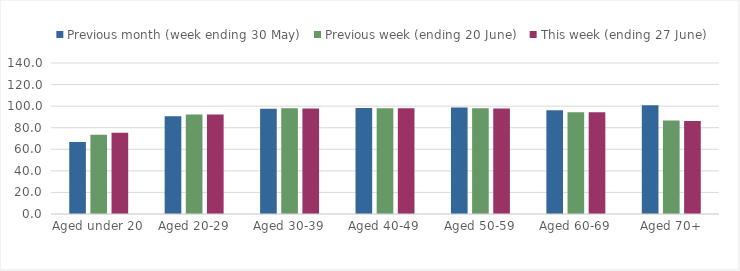
| Category | Previous month (week ending 30 May) | Previous week (ending 20 June) | This week (ending 27 June) |
|---|---|---|---|
| Aged under 20 | 66.688 | 73.555 | 75.414 |
| Aged 20-29 | 90.61 | 92.157 | 92.357 |
| Aged 30-39 | 97.658 | 98.123 | 97.861 |
| Aged 40-49 | 98.243 | 98.096 | 98.078 |
| Aged 50-59 | 98.696 | 98.142 | 97.912 |
| Aged 60-69 | 96.146 | 94.341 | 94.361 |
| Aged 70+ | 100.729 | 86.75 | 86.224 |